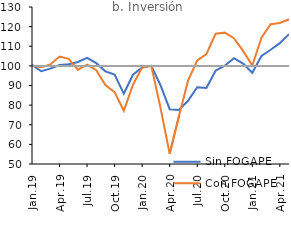
| Category | Sin FOGAPE | Con FOGAPE | Series 2 |
|---|---|---|---|
| 2019-01-01 | 100.489 | 100.134 | 100 |
| 2019-02-01 | 97.28 | 99.344 | 100 |
| 2019-03-01 | 98.602 | 100.741 | 100 |
| 2019-04-01 | 100.424 | 104.739 | 100 |
| 2019-05-01 | 100.788 | 103.596 | 100 |
| 2019-06-01 | 102.011 | 98.062 | 100 |
| 2019-07-01 | 104.101 | 100.649 | 100 |
| 2019-08-01 | 101.393 | 97.79 | 100 |
| 2019-09-01 | 97.223 | 90.281 | 100 |
| 2019-10-01 | 95.554 | 86.607 | 100 |
| 2019-11-01 | 85.837 | 77.107 | 100 |
| 2019-12-01 | 95.474 | 90.397 | 100 |
| 2020-01-01 | 99.19 | 99.115 | 100 |
| 2020-02-01 | 100 | 100 | 100 |
| 2020-03-01 | 90.145 | 78.655 | 100 |
| 2020-04-01 | 77.932 | 55.211 | 100 |
| 2020-05-01 | 77.572 | 74.2 | 100 |
| 2020-06-01 | 82.215 | 92.452 | 100 |
| 2020-07-01 | 89.14 | 102.726 | 100 |
| 2020-08-01 | 88.776 | 105.998 | 100 |
| 2020-09-01 | 97.53 | 116.362 | 100 |
| 2020-10-01 | 100.095 | 116.938 | 100 |
| 2020-11-01 | 103.899 | 114.104 | 100 |
| 2020-12-01 | 101.143 | 107.628 | 100 |
| 2021-01-01 | 96.48 | 100.183 | 100 |
| 2021-02-01 | 105.024 | 114.323 | 100 |
| 2021-03-01 | 108.212 | 121.208 | 100 |
| 2021-04-01 | 111.586 | 121.827 | 100 |
| 2021-05-01 | 116.19 | 123.735 | 100 |